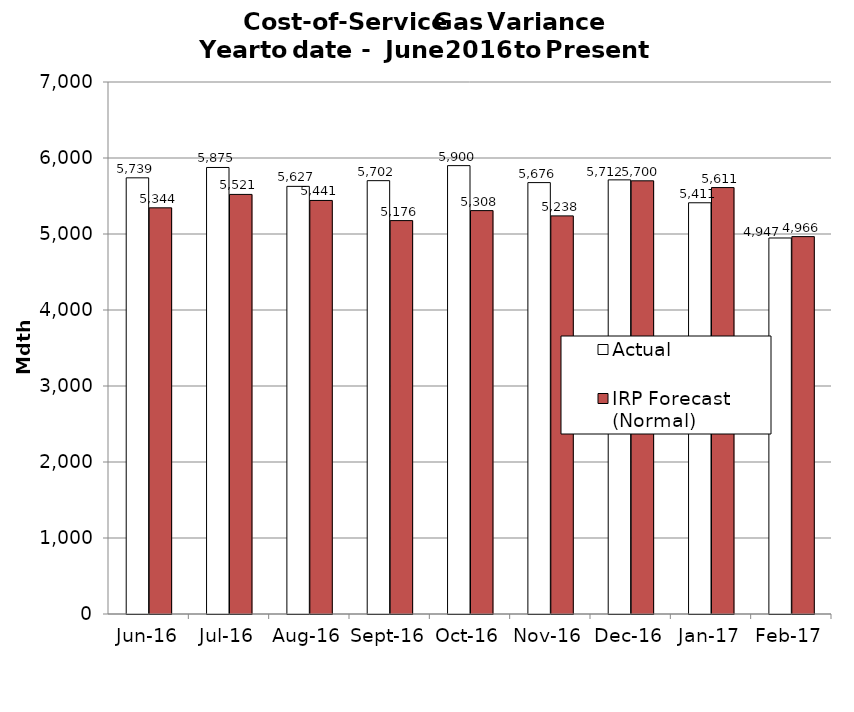
| Category | Actual | IRP Forecast (Normal) |
|---|---|---|
| 2016-06-01 | 5738.91 | 5344.298 |
| 2016-07-01 | 5875.25 | 5520.934 |
| 2016-08-01 | 5626.69 | 5441.377 |
| 2016-09-01 | 5701.73 | 5176.308 |
| 2016-10-01 | 5899.58 | 5307.677 |
| 2016-11-01 | 5676.22 | 5238.432 |
| 2016-12-01 | 5712.37 | 5699.654 |
| 2017-01-01 | 5410.81 | 5610.842 |
| 2017-02-01 | 4947.47 | 4965.635 |